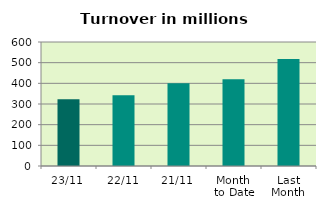
| Category | Series 0 |
|---|---|
| 23/11 | 323.48 |
| 22/11 | 342.086 |
| 21/11 | 400.763 |
| Month 
to Date | 419.768 |
| Last
Month | 517.71 |